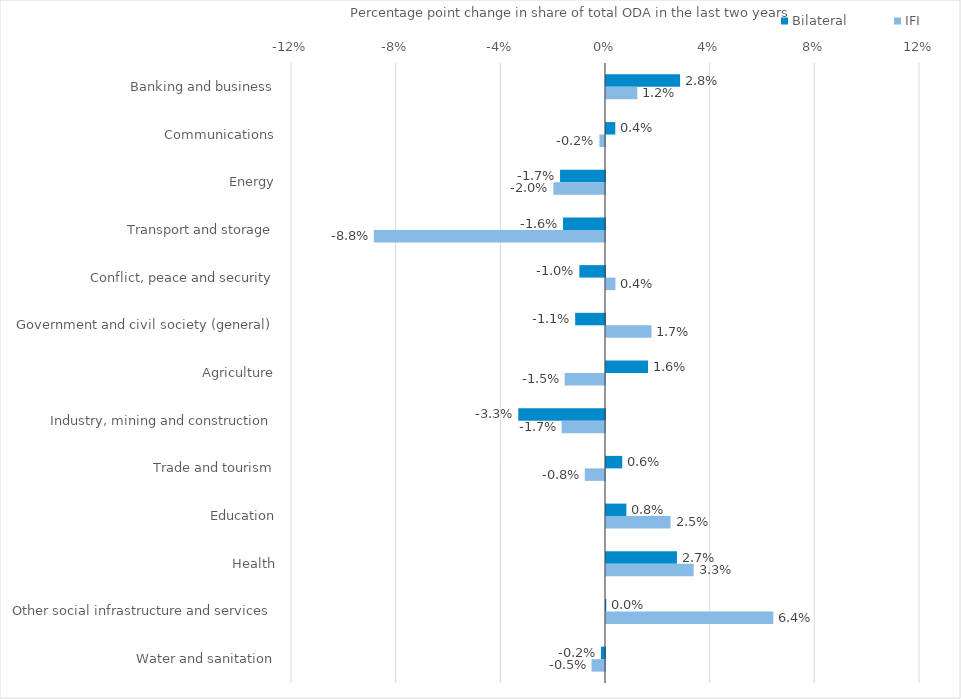
| Category | Bilateral | IFI |
|---|---|---|
| Banking and business | 0.028 | 0.012 |
| Communications | 0.004 | -0.002 |
| Energy | -0.017 | -0.02 |
| Transport and storage | -0.016 | -0.088 |
| Conflict, peace and security | -0.01 | 0.004 |
| Government and civil society (general) | -0.011 | 0.017 |
| Agriculture | 0.016 | -0.015 |
| Industry, mining and construction | -0.033 | -0.017 |
| Trade and tourism | 0.006 | -0.008 |
| Education | 0.008 | 0.025 |
| Health | 0.027 | 0.033 |
| Other social infrastructure and services | 0 | 0.064 |
| Water and sanitation | -0.002 | -0.005 |